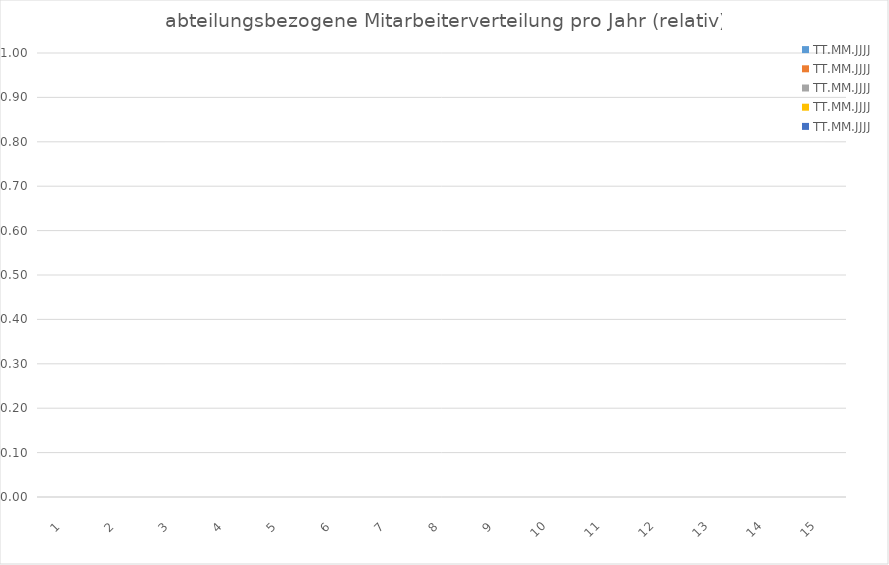
| Category | TT.MM.JJJJ |
|---|---|
| 0 | 0 |
| 1 | 0 |
| 2 | 0 |
| 3 | 0 |
| 4 | 0 |
| 5 | 0 |
| 6 | 0 |
| 7 | 0 |
| 8 | 0 |
| 9 | 0 |
| 10 | 0 |
| 11 | 0 |
| 12 | 0 |
| 13 | 0 |
| 14 | 0 |